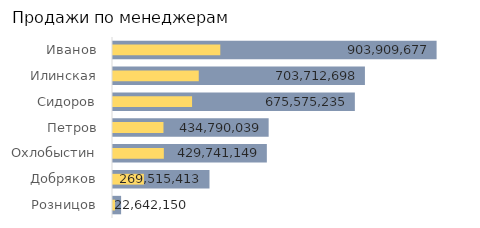
| Category | Сумма по полю Продажи без НДС |
|---|---|
| Розницов | 22642150.424 |
| Добряков | 269515412.585 |
| Охлобыстин | 429741149.153 |
| Петров | 434790038.814 |
| Сидоров | 675575235.212 |
| Илинская | 703712697.585 |
| Иванов | 903909677.373 |